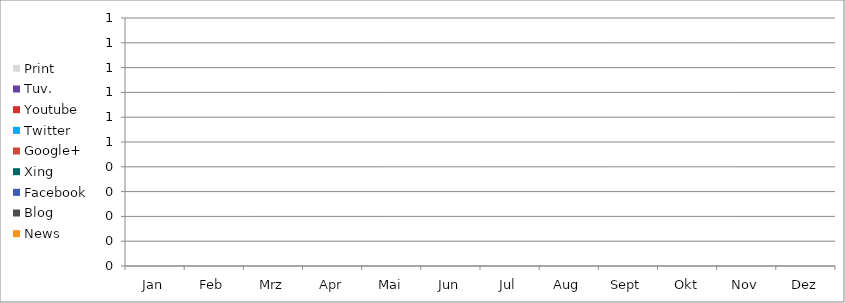
| Category | News | Blog | Facebook | Xing | Google+ | Twitter | Youtube | Tuv. | Print |
|---|---|---|---|---|---|---|---|---|---|
| Jan | 0 | 0 | 0 | 0 | 0 | 0 | 0 | 0 | 0 |
| Feb | 0 | 0 | 0 | 0 | 0 | 0 | 0 | 0 | 0 |
| Mrz | 0 | 0 | 0 | 0 | 0 | 0 | 0 | 0 | 0 |
| Apr | 0 | 0 | 0 | 0 | 0 | 0 | 0 | 0 | 0 |
| Mai | 0 | 0 | 0 | 0 | 0 | 0 | 0 | 0 | 0 |
| Jun | 0 | 0 | 0 | 0 | 0 | 0 | 0 | 0 | 0 |
| Jul | 0 | 0 | 0 | 0 | 0 | 0 | 0 | 0 | 0 |
| Aug | 0 | 0 | 0 | 0 | 0 | 0 | 0 | 0 | 0 |
| Sept | 0 | 0 | 0 | 0 | 0 | 0 | 0 | 0 | 0 |
| Okt | 0 | 0 | 0 | 0 | 0 | 0 | 0 | 0 | 0 |
| Nov | 0 | 0 | 0 | 0 | 0 | 0 | 0 | 0 | 0 |
| Dez | 0 | 0 | 0 | 0 | 0 | 0 | 0 | 0 | 0 |